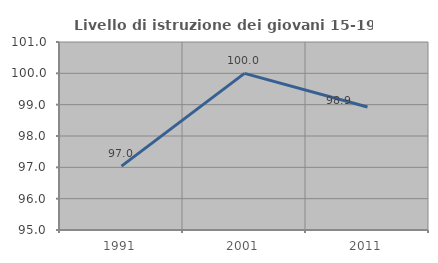
| Category | Livello di istruzione dei giovani 15-19 anni |
|---|---|
| 1991.0 | 97.037 |
| 2001.0 | 100 |
| 2011.0 | 98.925 |